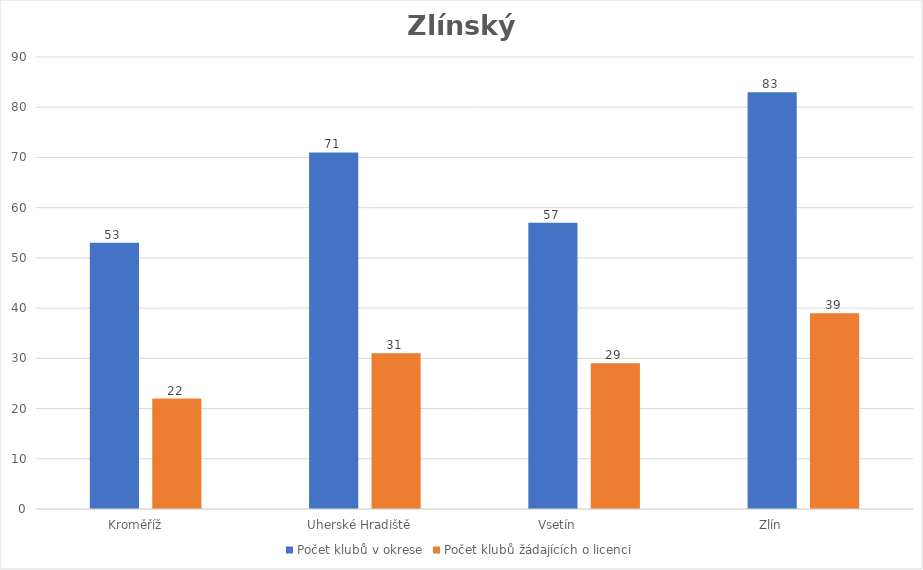
| Category | Počet klubů v okrese | Počet klubů žádajících o licenci |
|---|---|---|
| Kroměříž      | 53 | 22 |
| Uherské Hradiště   | 71 | 31 |
| Vsetín              | 57 | 29 |
| Zlín                 | 83 | 39 |